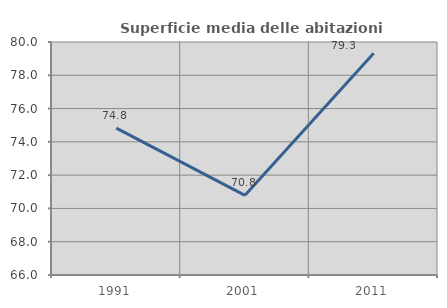
| Category | Superficie media delle abitazioni occupate |
|---|---|
| 1991.0 | 74.828 |
| 2001.0 | 70.789 |
| 2011.0 | 79.326 |